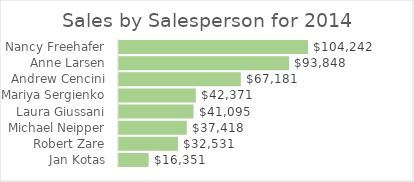
| Category | Total |
|---|---|
| Jan Kotas | 16350.5 |
| Robert Zare | 32530.6 |
| Michael Neipper | 37418 |
| Laura Giussani | 41095.01 |
| Mariya Sergienko | 42370.88 |
| Andrew Cencini | 67180.5 |
| Anne Larsen | 93848.33 |
| Nancy Freehafer | 104242.34 |